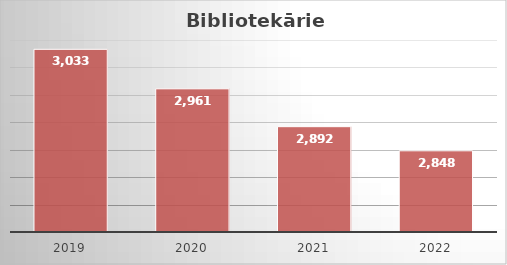
| Category | Series 0 |
|---|---|
| 2019.0 | 3033 |
| 2020.0 | 2961 |
| 2021.0 | 2892 |
| 2022.0 | 2848 |